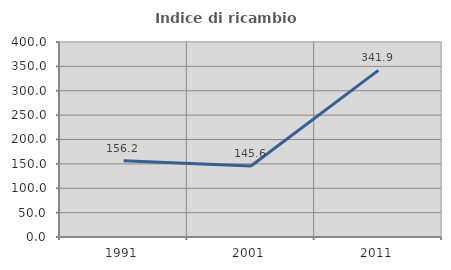
| Category | Indice di ricambio occupazionale  |
|---|---|
| 1991.0 | 156.164 |
| 2001.0 | 145.556 |
| 2011.0 | 341.86 |